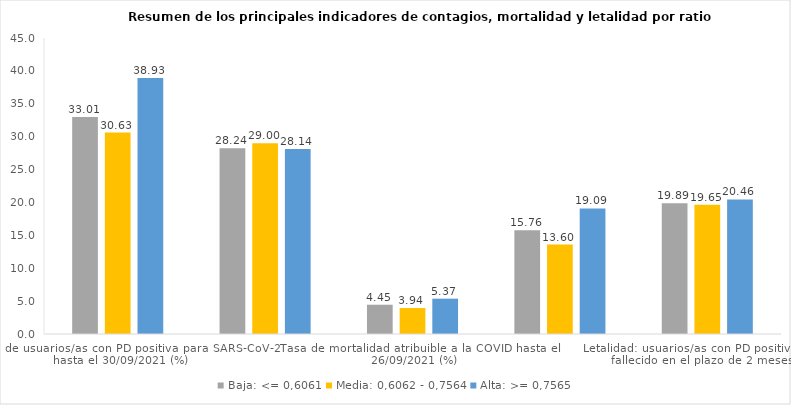
| Category | Baja: <= 0,6061 | Media: 0,6062 - 0,7564 | Alta: >= 0,7565 |
|---|---|---|---|
| Tasa de usuarios/as con PD positiva para SARS-CoV-2 hasta el 30/09/2021 (%) | 33.009 | 30.628 | 38.925 |
| Tasa de mortalidad por todas las causas hasta el 26/09/2021 (%) | 28.242 | 29.002 | 28.139 |
| Tasa de mortalidad atribuible a la COVID hasta el 26/09/2021 (%) | 4.451 | 3.944 | 5.371 |
| Proporción de los fallecimientos totales atribuibles a la COVID hasta el 26/09/2021 (%) | 15.759 | 13.598 | 19.086 |
| Letalidad: usuarios/as con PD positiva que han fallecido en el plazo de 2 meses (%) | 19.892 | 19.651 | 20.464 |